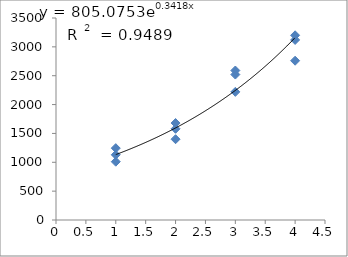
| Category | Series 0 |
|---|---|
| 1.0 | 1010 |
| 1.0 | 1245 |
| 1.0 | 1130 |
| 2.0 | 1680 |
| 2.0 | 1580 |
| 2.0 | 1400 |
| 3.0 | 2220 |
| 3.0 | 2590 |
| 3.0 | 2520 |
| 4.0 | 2760 |
| 4.0 | 3200 |
| 4.0 | 3120 |